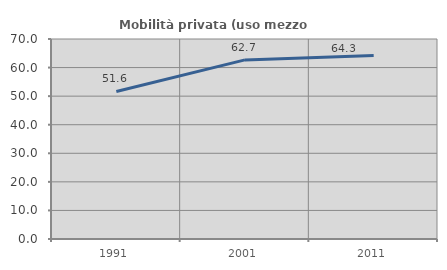
| Category | Mobilità privata (uso mezzo privato) |
|---|---|
| 1991.0 | 51.641 |
| 2001.0 | 62.688 |
| 2011.0 | 64.264 |